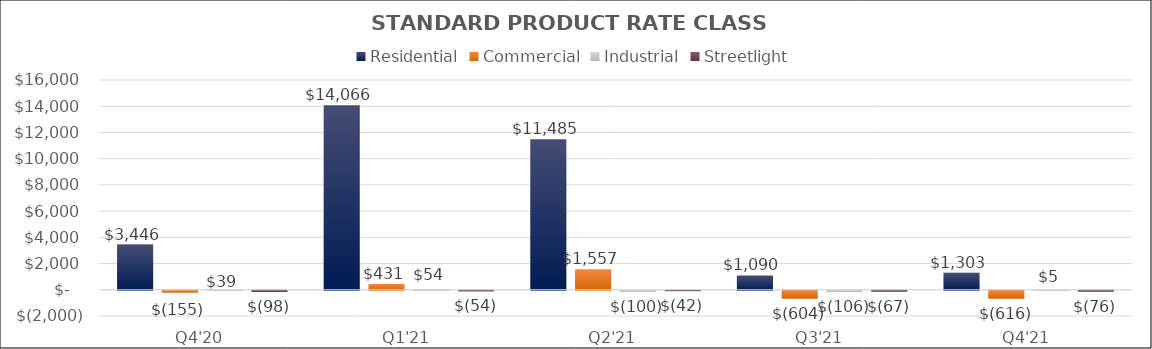
| Category | Residential | Commercial | Industrial | Streetlight |
|---|---|---|---|---|
| Q4'20 | 3446.134 | -154.962 | 39 | -98 |
| Q1'21 | 14066.133 | 431.439 | 54.07 | -54.326 |
| Q2'21 | 11485.074 | 1556.569 | -99.781 | -41.653 |
| Q3'21 | 1089.763 | -604.482 | -105.976 | -66.77 |
| Q4'21 | 1302.85 | -615.876 | 5.28 | -76.121 |